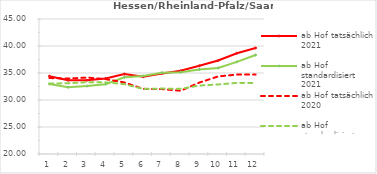
| Category | ab Hof tatsächlich 2021 | ab Hof standardisiert 2021 | ab Hof tatsächlich 2020 | ab Hof standardisiert 2020 |
|---|---|---|---|---|
| 0 | 34.411 | 32.971 | 34.065 | 33.045 |
| 1 | 33.65 | 32.369 | 33.963 | 33.105 |
| 2 | 33.671 | 32.582 | 34.16 | 33.29 |
| 3 | 33.99 | 32.934 | 33.869 | 33.274 |
| 4 | 34.814 | 34.216 | 33.247 | 32.932 |
| 5 | 34.296 | 34.459 | 32.064 | 32.051 |
| 6 | 34.905 | 35.059 | 32.02 | 32.112 |
| 7 | 35.408 | 35.143 | 31.714 | 32.066 |
| 8 | 36.336 | 35.657 | 33.229 | 32.673 |
| 9 | 37.31 | 35.943 | 34.366 | 32.879 |
| 10 | 38.668 | 37.059 | 34.706 | 33.172 |
| 11 | 39.638 | 38.337 | 34.707 | 33.163 |